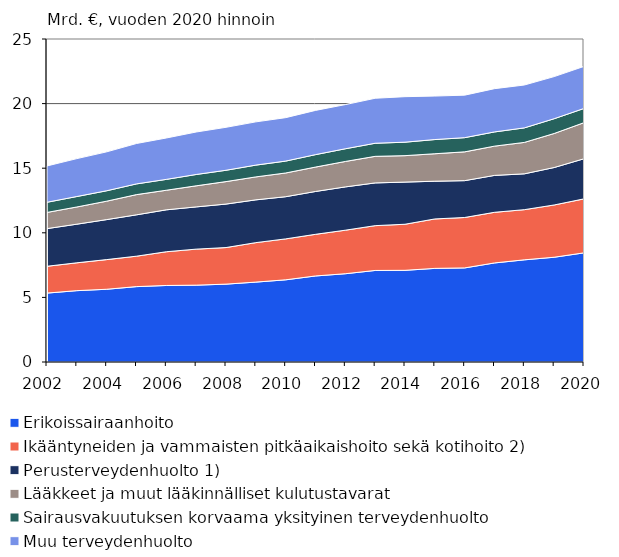
| Category | Erikoissairaanhoito | Ikääntyneiden ja vammaisten pitkäaikaishoito sekä kotihoito 2) | Perusterveydenhuolto 1)  | Lääkkeet ja muut lääkinnälliset kulutustavarat | Sairausvakuutuksen korvaama yksityinen terveydenhuolto | Muu terveydenhuolto |
|---|---|---|---|---|---|---|
| 2002 | 5.334 | 2.075 | 2.914 | 1.252 | 0.787 | 2.812 |
| 2003 | 5.523 | 2.155 | 2.989 | 1.332 | 0.808 | 2.934 |
| 2004 | 5.63 | 2.296 | 3.096 | 1.426 | 0.806 | 3.013 |
| 2005 | 5.835 | 2.356 | 3.202 | 1.563 | 0.83 | 3.127 |
| 2006 | 5.922 | 2.611 | 3.245 | 1.515 | 0.841 | 3.203 |
| 2007 | 5.947 | 2.789 | 3.269 | 1.632 | 0.877 | 3.288 |
| 2008 | 6.027 | 2.831 | 3.365 | 1.739 | 0.877 | 3.325 |
| 2009 | 6.184 | 3.054 | 3.312 | 1.776 | 0.912 | 3.348 |
| 2010 | 6.361 | 3.168 | 3.264 | 1.836 | 0.921 | 3.363 |
| 2011 | 6.66 | 3.222 | 3.316 | 1.889 | 0.963 | 3.424 |
| 2012 | 6.832 | 3.369 | 3.352 | 1.968 | 0.982 | 3.419 |
| 2013 | 7.085 | 3.469 | 3.307 | 2.056 | 1.014 | 3.483 |
| 2014 | 7.096 | 3.566 | 3.263 | 2.046 | 1.042 | 3.524 |
| 2015 | 7.246 | 3.826 | 2.921 | 2.125 | 1.098 | 3.367 |
| 2016 | 7.283 | 3.903 | 2.852 | 2.229 | 1.097 | 3.291 |
| 2017 | 7.666 | 3.92 | 2.857 | 2.265 | 1.099 | 3.348 |
| 2018 | 7.907 | 3.884 | 2.773 | 2.431 | 1.125 | 3.318 |
| 2019 | 8.108 | 4.046 | 2.899 | 2.633 | 1.143 | 3.263 |
| 2020 | 8.448 | 4.178 | 3.105 | 2.793 | 1.1 | 3.256 |